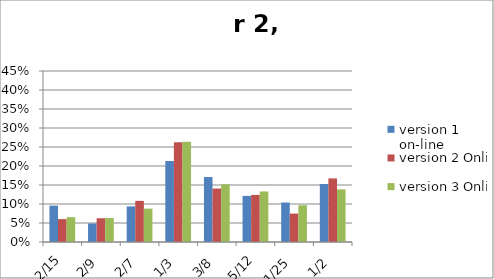
| Category | version 1 on-line | version 2 Online | version 3 Online |
|---|---|---|---|
| 0.13333333333333333 | 0.096 | 0.06 | 0.065 |
| 0.2222222222222222 | 0.049 | 0.062 | 0.063 |
| 0.2857142857142857 | 0.094 | 0.108 | 0.088 |
| 0.3333333333333333 | 0.213 | 0.262 | 0.264 |
| 0.375 | 0.171 | 0.141 | 0.152 |
| 0.4166666666666667 | 0.121 | 0.124 | 0.133 |
| 0.44 | 0.104 | 0.075 | 0.097 |
| 0.5 | 0.153 | 0.167 | 0.139 |